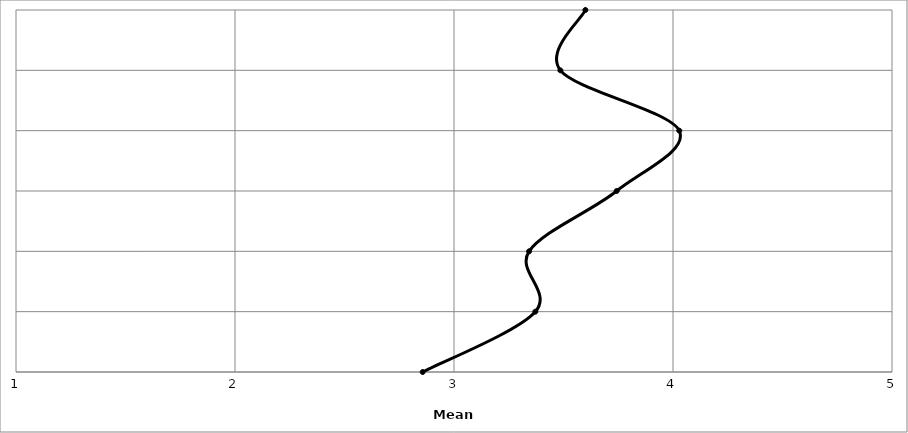
| Category | Series 1 |
|---|---|
| Adequate | 5 |
| Chaotic | 5 |
| Open | 5 |
| Complex | 5 |
| Old-fashioned | 5 |
| Ineffective | 5 |
| Innovative | 5 |